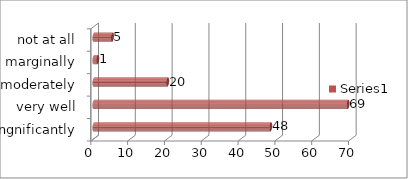
| Category | Series 0 |
|---|---|
| singnificantly | 48 |
| very well | 69 |
| moderately | 20 |
| marginally | 1 |
| not at all | 5 |